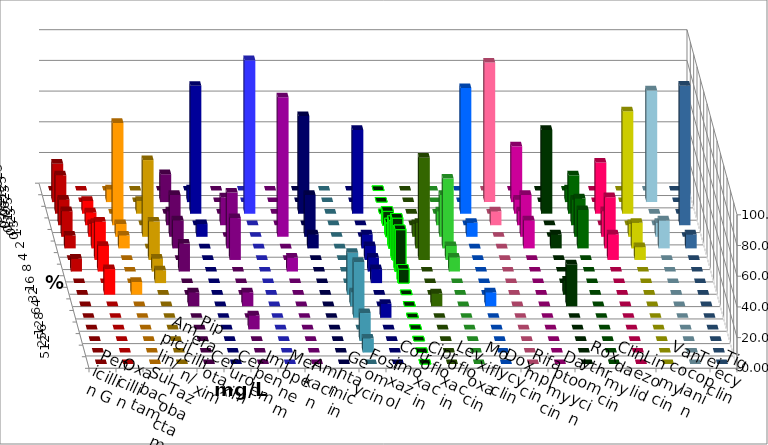
| Category | Penicillin G | Oxacillin | Ampicillin/ Sulbactam | Piperacillin/ Tazobactam | Cefotaxim | Cefuroxim | Imipenem | Meropenem | Amikacin | Gentamicin | Fosfomycin | Cotrimoxazol | Ciprofloxacin | Levofloxacin | Moxifloxacin | Doxycyclin | Rifampicin | Daptomycin | Roxythromycin | Clindamycin | Linezolid | Vancomycin | Teicoplanin | Tigecyclin |
|---|---|---|---|---|---|---|---|---|---|---|---|---|---|---|---|---|---|---|---|---|---|---|---|---|
| 0.015625 | 0 | 0 | 0 | 0 | 0 | 0 | 0 | 0 | 0 | 0 | 0 | 0 | 0 | 0 | 0 | 0 | 0 | 0 | 0 | 0 | 0 | 0 | 0 | 0 |
| 0.03125 | 25 | 0 | 8.333 | 0 | 18.182 | 0 | 8.333 | 0 | 0 | 0 | 0 | 0 | 0 | 0 | 0 | 0 | 90.909 | 36.364 | 0 | 8.333 | 0 | 0 | 0 | 72.727 |
| 0.0625 | 25 | 8.333 | 0 | 8.333 | 0 | 0 | 83.333 | 100 | 0 | 63.636 | 0 | 54.545 | 0 | 0 | 0 | 81.818 | 0 | 9.091 | 54.545 | 25 | 33.333 | 66.667 | 0 | 0 |
| 0.125 | 16.667 | 8.333 | 66.667 | 0 | 9.091 | 18.182 | 0 | 0 | 0 | 0 | 0 | 0 | 9.091 | 0 | 9.091 | 0 | 9.091 | 9.091 | 0 | 16.667 | 0 | 0 | 90.909 | 0 |
| 0.25 | 16.667 | 8.333 | 8.333 | 50 | 27.273 | 0 | 8.333 | 0 | 90.909 | 27.273 | 0 | 0 | 9.091 | 8.333 | 27.273 | 9.091 | 0 | 27.273 | 0 | 25 | 16.667 | 8.333 | 0 | 9.091 |
| 0.5 | 8.333 | 16.667 | 8.333 | 0 | 18.182 | 36.364 | 0 | 0 | 0 | 9.091 | 0 | 9.091 | 18.182 | 16.667 | 45.455 | 0 | 0 | 18.182 | 9.091 | 25 | 33.333 | 16.667 | 9.091 | 18.182 |
| 1.0 | 0 | 25 | 0 | 25 | 0 | 27.273 | 0 | 0 | 0 | 0 | 0 | 9.091 | 27.273 | 66.667 | 9.091 | 0 | 0 | 0 | 0 | 0 | 16.667 | 8.333 | 0 | 0 |
| 2.0 | 8.333 | 16.667 | 0 | 8.333 | 18.182 | 0 | 0 | 0 | 9.091 | 0 | 0 | 9.091 | 27.273 | 0 | 9.091 | 0 | 0 | 0 | 0 | 0 | 0 | 0 | 0 | 0 |
| 4.0 | 0 | 0 | 0 | 8.333 | 0 | 0 | 0 | 0 | 0 | 0 | 0 | 9.091 | 9.091 | 0 | 0 | 0 | 0 | 0 | 0 | 0 | 0 | 0 | 0 | 0 |
| 8.0 | 0 | 16.667 | 8.333 | 0 | 0 | 0 | 0 | 0 | 0 | 0 | 27.273 | 0 | 0 | 0 | 0 | 0 | 0 | 0 | 9.091 | 0 | 0 | 0 | 0 | 0 |
| 16.0 | 0 | 0 | 0 | 0 | 9.091 | 9.091 | 0 | 0 | 0 | 0 | 9.091 | 0 | 0 | 8.333 | 0 | 9.091 | 0 | 0 | 27.273 | 0 | 0 | 0 | 0 | 0 |
| 32.0 | 0 | 0 | 0 | 0 | 0 | 0 | 0 | 0 | 0 | 0 | 36.364 | 9.091 | 0 | 0 | 0 | 0 | 0 | 0 | 0 | 0 | 0 | 0 | 0 | 0 |
| 64.0 | 0 | 0 | 0 | 0 | 0 | 9.091 | 0 | 0 | 0 | 0 | 0 | 0 | 0 | 0 | 0 | 0 | 0 | 0 | 0 | 0 | 0 | 0 | 0 | 0 |
| 128.0 | 0 | 0 | 0 | 0 | 0 | 0 | 0 | 0 | 0 | 0 | 18.182 | 0 | 0 | 0 | 0 | 0 | 0 | 0 | 0 | 0 | 0 | 0 | 0 | 0 |
| 256.0 | 0 | 0 | 0 | 0 | 0 | 0 | 0 | 0 | 0 | 0 | 9.091 | 0 | 0 | 0 | 0 | 0 | 0 | 0 | 0 | 0 | 0 | 0 | 0 | 0 |
| 512.0 | 0 | 0 | 0 | 0 | 0 | 0 | 0 | 0 | 0 | 0 | 0 | 0 | 0 | 0 | 0 | 0 | 0 | 0 | 0 | 0 | 0 | 0 | 0 | 0 |